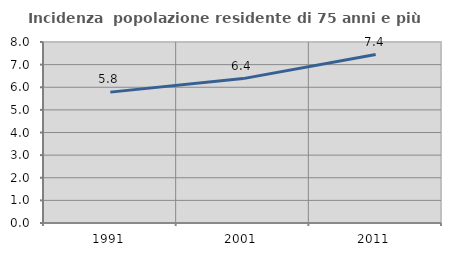
| Category | Incidenza  popolazione residente di 75 anni e più |
|---|---|
| 1991.0 | 5.785 |
| 2001.0 | 6.382 |
| 2011.0 | 7.446 |